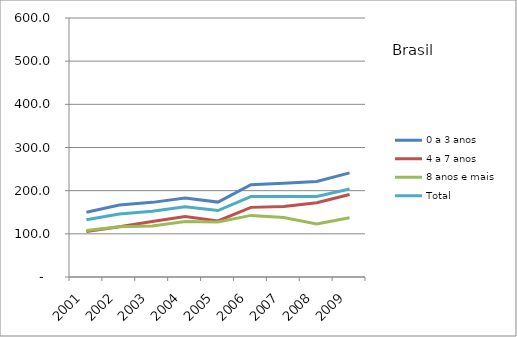
| Category | 0 a 3 anos | 4 a 7 anos | 8 anos e mais | Total |
|---|---|---|---|---|
| 2001.0 | 149.9 | 105.5 | 107.5 | 132.6 |
| 2002.0 | 166.9 | 116.5 | 116.2 | 146.1 |
| 2003.0 | 172.9 | 128.5 | 117.9 | 152.5 |
| 2004.0 | 183.1 | 140.4 | 128.7 | 162.9 |
| 2005.0 | 173.5 | 129.9 | 127.2 | 154 |
| 2006.0 | 213.8 | 161.3 | 142.7 | 186.2 |
| 2007.0 | 216.9 | 163.4 | 137.6 | 186.2 |
| 2008.0 | 221.4 | 172.1 | 122.7 | 186.4 |
| 2009.0 | 241.2 | 191 | 137.4 | 204 |